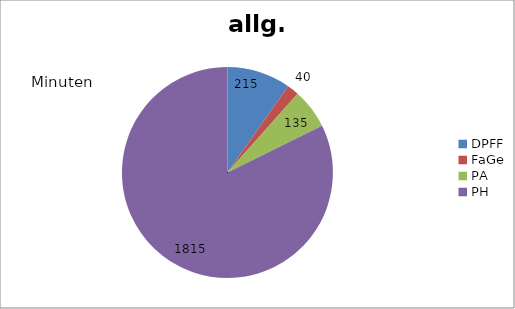
| Category | allg. Küchenarbeit |
|---|---|
| DPFF | 215 |
| FaGe | 40 |
| PA | 135 |
| PH | 1815 |